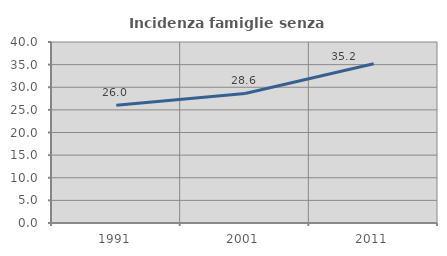
| Category | Incidenza famiglie senza nuclei |
|---|---|
| 1991.0 | 26.033 |
| 2001.0 | 28.623 |
| 2011.0 | 35.178 |